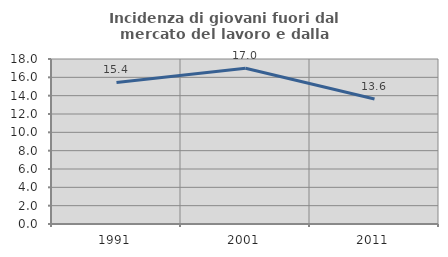
| Category | Incidenza di giovani fuori dal mercato del lavoro e dalla formazione  |
|---|---|
| 1991.0 | 15.447 |
| 2001.0 | 16.99 |
| 2011.0 | 13.636 |